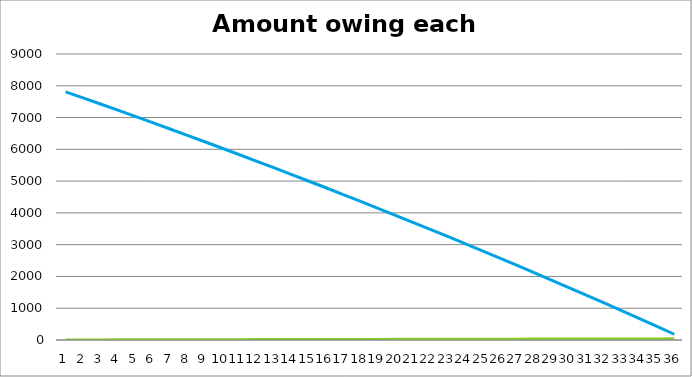
| Category | Series 0 | Series 1 |
|---|---|---|
| 0 | 1 | 7810 |
| 1 | 2 | 7618.575 |
| 2 | 3 | 7425.714 |
| 3 | 4 | 7231.407 |
| 4 | 5 | 7035.643 |
| 5 | 6 | 6838.41 |
| 6 | 7 | 6639.698 |
| 7 | 8 | 6439.496 |
| 8 | 9 | 6237.792 |
| 9 | 10 | 6034.576 |
| 10 | 11 | 5829.835 |
| 11 | 12 | 5623.559 |
| 12 | 13 | 5415.735 |
| 13 | 14 | 5206.353 |
| 14 | 15 | 4995.401 |
| 15 | 16 | 4782.866 |
| 16 | 17 | 4568.738 |
| 17 | 18 | 4353.003 |
| 18 | 19 | 4135.651 |
| 19 | 20 | 3916.668 |
| 20 | 21 | 3696.043 |
| 21 | 22 | 3473.764 |
| 22 | 23 | 3249.817 |
| 23 | 24 | 3024.191 |
| 24 | 25 | 2796.872 |
| 25 | 26 | 2567.849 |
| 26 | 27 | 2337.107 |
| 27 | 28 | 2104.636 |
| 28 | 29 | 1870.42 |
| 29 | 30 | 1634.449 |
| 30 | 31 | 1396.707 |
| 31 | 32 | 1157.182 |
| 32 | 33 | 915.861 |
| 33 | 34 | 672.73 |
| 34 | 35 | 427.776 |
| 35 | 36 | 180.984 |